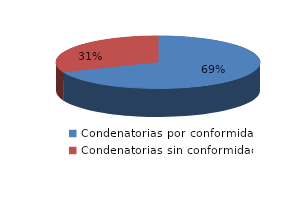
| Category | Series 0 |
|---|---|
| 0 | 512 |
| 1 | 232 |